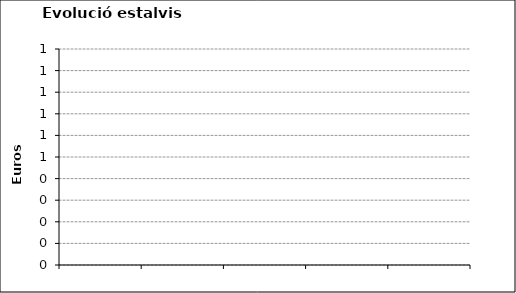
| Category | kWh totals estalviats acumulats |
|---|---|
| 0 | 0 |
| 1 | 0 |
| 2 | 0 |
| 3 | 0 |
| 4 | 0 |